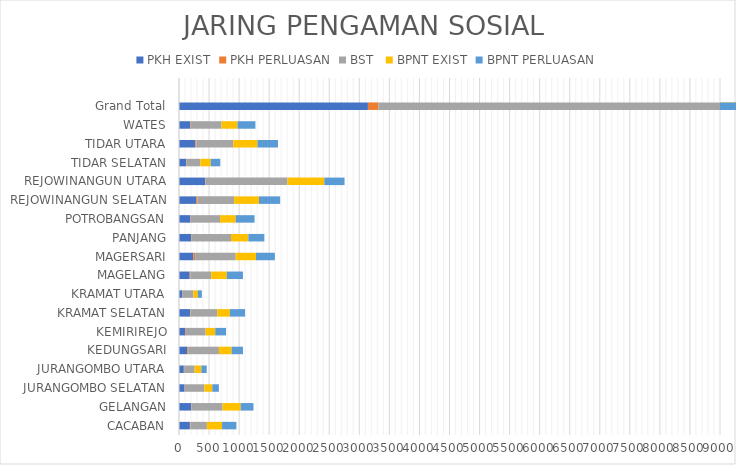
| Category | PKH | BST | BPNT |
|---|---|---|---|
| CACABAN | 9 | 274 | 239 |
| GELANGAN | 8 | 514 | 213 |
| JURANGOMBO SELATAN | 4 | 327 | 109 |
| JURANGOMBO UTARA | 5 | 175 | 89 |
| KEDUNGSARI | 14 | 512 | 189 |
| KEMIRIREJO | 9 | 328 | 180 |
| KRAMAT SELATAN | 8 | 443 | 254 |
| KRAMAT UTARA | 2 | 187 | 66 |
| MAGELANG | 12 | 347 | 268 |
| MAGERSARI | 28 | 675 | 314 |
| PANJANG | 8 | 653 | 266 |
| POTROBANGSAN | 5 | 489 | 314 |
| REJOWINANGUN SELATAN | 22 | 610 | 352 |
| REJOWINANGUN UTARA | 7 | 1363 | 337 |
| TIDAR SELATAN | 7 | 229 | 158 |
| TIDAR UTARA | 18 | 613 | 341 |
| WATES | 8 | 513 | 298 |
| Grand Total | 174 | 8252 | 3987 |